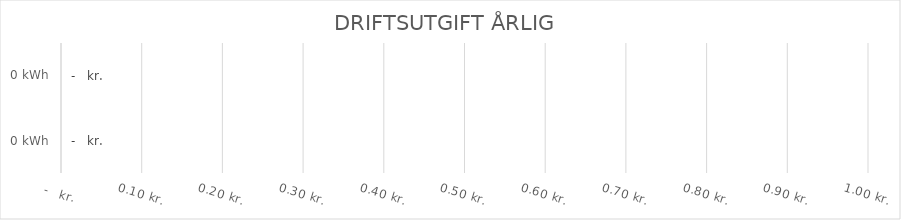
| Category | ENERGIUTGIFT ÅRLIG KR./KWH  |
|---|---|
| 0.0 | 0 |
| 0.0 | 0 |